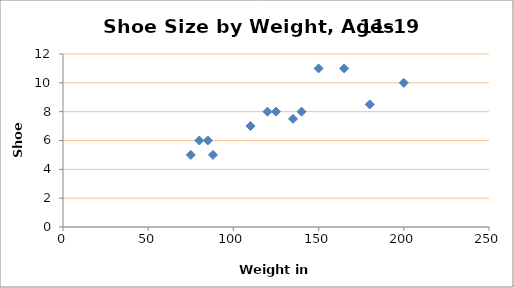
| Category |  Shoe Size |
|---|---|
| 75.0 | 5 |
| 85.0 | 6 |
| 88.0 | 5 |
| 135.0 | 7.5 |
| 80.0 | 6 |
| 180.0 | 8.5 |
| 140.0 | 8 |
| 200.0 | 10 |
| 110.0 | 7 |
| 120.0 | 8 |
| 150.0 | 11 |
| 125.0 | 8 |
| 165.0 | 11 |